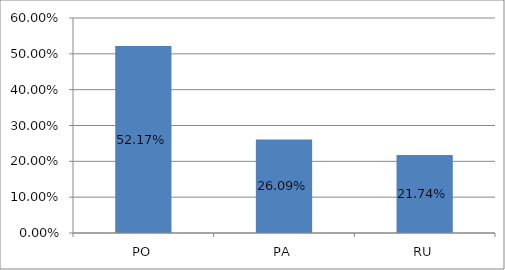
| Category | Series 0 |
|---|---|
| PO | 0.522 |
| PA | 0.261 |
| RU | 0.217 |